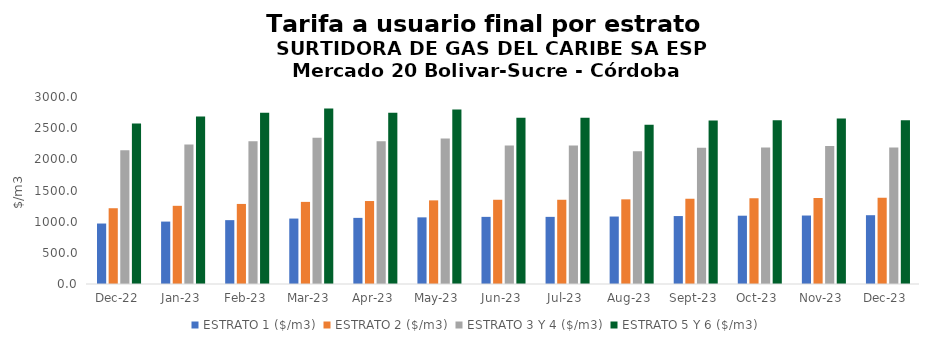
| Category | ESTRATO 1 ($/m3) | ESTRATO 2 ($/m3) | ESTRATO 3 Y 4 ($/m3) | ESTRATO 5 Y 6 ($/m3) |
|---|---|---|---|---|
| 2022-12-01 | 970.22 | 1215.6 | 2146.46 | 2575.752 |
| 2023-01-01 | 1001.38 | 1254.3 | 2238.4 | 2686.08 |
| 2023-02-01 | 1024.53 | 1284.4 | 2288.91 | 2746.692 |
| 2023-03-01 | 1049.77 | 1317.27 | 2345.6 | 2814.72 |
| 2023-04-01 | 1060.8 | 1331.1 | 2289.32 | 2747.184 |
| 2023-05-01 | 1069.09 | 1341.51 | 2332.27 | 2798.724 |
| 2023-06-01 | 1076.98 | 1351.41 | 2221.89 | 2666.268 |
| 2023-07-01 | 1076.98 | 1351.41 | 2221.89 | 2666.268 |
| 2023-08-01 | 1082.37 | 1358.18 | 2129.89 | 2555.868 |
| 2023-09-01 | 1089.94 | 1367.67 | 2187.17 | 2624.604 |
| 2023-10-01 | 1095.74 | 1374.95 | 2190.44 | 2628.528 |
| 2023-11-01 | 1098.48 | 1378.38 | 2212.27 | 2654.724 |
| 2023-12-01 | 1103.63 | 1384.85 | 2189.08 | 2626.896 |